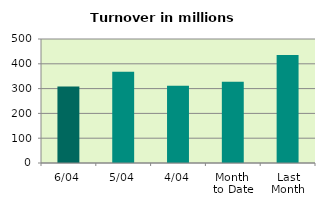
| Category | Series 0 |
|---|---|
| 6/04 | 308.919 |
| 5/04 | 368.098 |
| 4/04 | 311.605 |
| Month 
to Date | 327.959 |
| Last
Month | 435.216 |